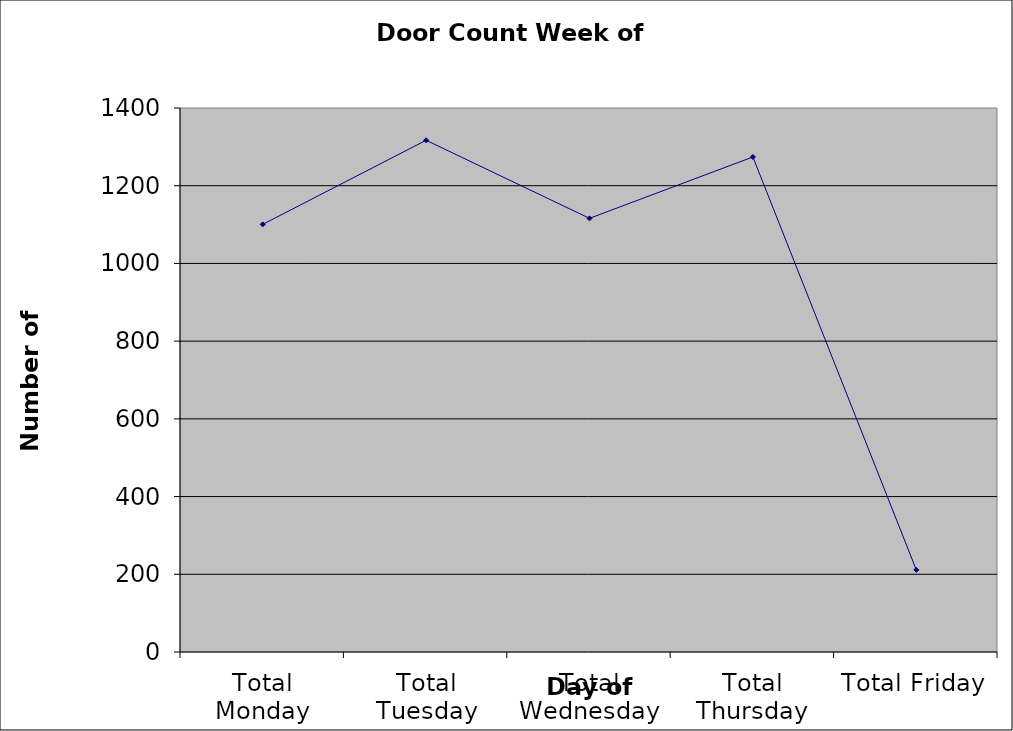
| Category | Series 0 |
|---|---|
| Total Monday | 1100.5 |
| Total Tuesday | 1317 |
| Total Wednesday | 1116 |
| Total Thursday | 1274 |
| Total Friday | 211.5 |